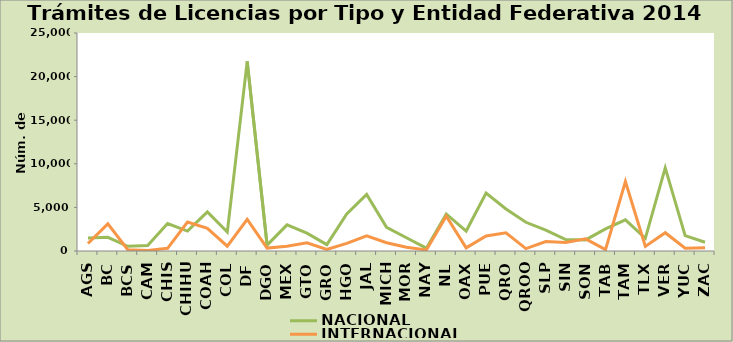
| Category | NACIONAL | INTERNACIONAL |
|---|---|---|
| AGS | 1489 | 861 |
| BC | 1565 | 3116 |
| BCS | 543 | 144 |
| CAM | 618 | 60 |
| CHIS | 3147 | 310 |
| CHIHU | 2286 | 3327 |
| COAH | 4481 | 2593 |
| COL | 2172 | 548 |
| DF | 21749 | 3622 |
| DGO | 672 | 332 |
| MEX | 2996 | 547 |
| GTO | 2039 | 943 |
| GRO | 727 | 176 |
| HGO | 4238 | 866 |
| JAL | 6478 | 1745 |
| MICH | 2713 | 946 |
| MOR | 1519 | 431 |
| NAY | 325 | 116 |
| NL | 4245 | 3996 |
| OAX | 2290 | 361 |
| PUE | 6646 | 1714 |
| QRO | 4815 | 2086 |
| QROO | 3293 | 274 |
| SLP | 2399 | 1086 |
| SIN | 1307 | 965 |
| SON | 1269 | 1395 |
| TAB | 2534 | 152 |
| TAM | 3569 | 7960 |
| TLX | 1458 | 522 |
| VER | 9524 | 2097 |
| YUC | 1767 | 316 |
| ZAC | 1002 | 375 |